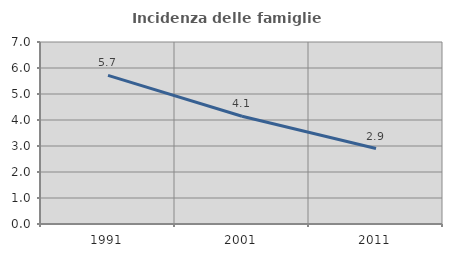
| Category | Incidenza delle famiglie numerose |
|---|---|
| 1991.0 | 5.714 |
| 2001.0 | 4.145 |
| 2011.0 | 2.903 |